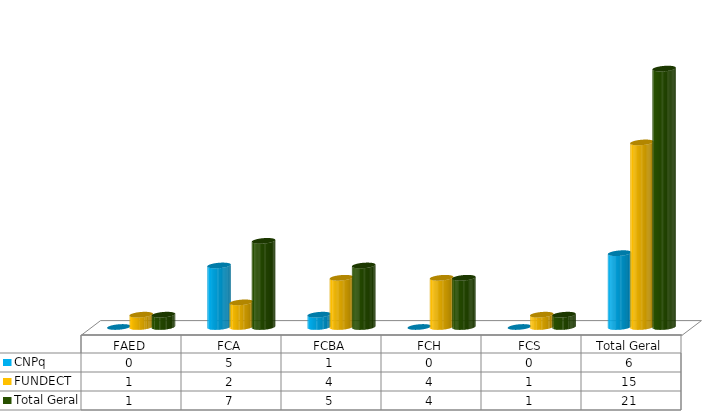
| Category | CNPq | FUNDECT | Total Geral |
|---|---|---|---|
| FAED | 0 | 1 | 1 |
| FCA | 5 | 2 | 7 |
| FCBA | 1 | 4 | 5 |
| FCH | 0 | 4 | 4 |
| FCS | 0 | 1 | 1 |
| Total Geral | 6 | 15 | 21 |